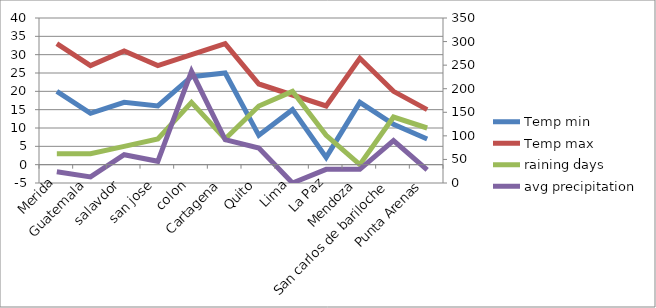
| Category | Temp min | Temp max | raining days |
|---|---|---|---|
| Merida | 20 | 33 | 3 |
| Guatemala | 14 | 27 | 3 |
| salavdor | 17 | 31 | 5 |
| san jose | 16 | 27 | 7 |
| colon | 24 | 30 | 17 |
| Cartagena | 25 | 33 | 7 |
| Quito | 8 | 22 | 16 |
| Lima | 15 | 19 | 20 |
| La Paz | 2 | 16 | 8 |
| Mendoza | 17 | 29 | 0 |
| San carlos de bariloche | 11 | 20 | 13 |
| Punta Arenas | 7 | 15 | 10 |